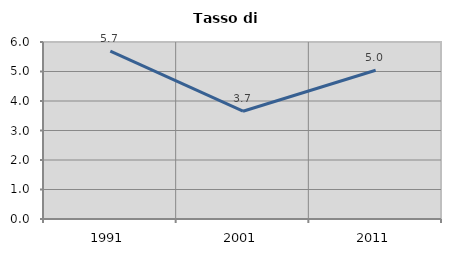
| Category | Tasso di disoccupazione   |
|---|---|
| 1991.0 | 5.691 |
| 2001.0 | 3.653 |
| 2011.0 | 5.044 |